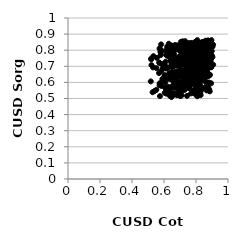
| Category | Series 0 |
|---|---|
| 0.8032709693896705 | 0.546 |
| 0.7423548564855764 | 0.582 |
| 0.6598434259487107 | 0.657 |
| 0.8691043415368068 | 0.675 |
| 0.8714225391466073 | 0.713 |
| 0.7827376489282902 | 0.551 |
| 0.6778970178173784 | 0.749 |
| 0.765579957225321 | 0.842 |
| 0.8115892868456154 | 0.724 |
| 0.796213893338463 | 0.794 |
| 0.7727589334761511 | 0.693 |
| 0.6329274914132588 | 0.784 |
| 0.8553405302881449 | 0.812 |
| 0.5689961544769234 | 0.658 |
| 0.7640300589531128 | 0.769 |
| 0.6557807507965396 | 0.641 |
| 0.6091190718727961 | 0.728 |
| 0.6632267273853174 | 0.774 |
| 0.8471008135141167 | 0.669 |
| 0.7099137604627728 | 0.739 |
| 0.5938261171411459 | 0.69 |
| 0.8681933570394909 | 0.732 |
| 0.64987128310343 | 0.825 |
| 0.5747970729806625 | 0.515 |
| 0.8402530996299308 | 0.564 |
| 0.5775720611950468 | 0.804 |
| 0.6837698497112241 | 0.748 |
| 0.6935339429260345 | 0.566 |
| 0.7906924804094604 | 0.55 |
| 0.7119114350522229 | 0.712 |
| 0.8137696616904289 | 0.706 |
| 0.7173182907097406 | 0.594 |
| 0.6727061191246002 | 0.829 |
| 0.8824640731678026 | 0.557 |
| 0.6939071413159161 | 0.714 |
| 0.6333331862572439 | 0.658 |
| 0.880119370819711 | 0.64 |
| 0.8771130128697302 | 0.693 |
| 0.6607062792613847 | 0.761 |
| 0.7282156086045215 | 0.558 |
| 0.8045231410309145 | 0.539 |
| 0.6472357720883822 | 0.774 |
| 0.8404713862704031 | 0.722 |
| 0.5397078846793173 | 0.546 |
| 0.7272654293517986 | 0.782 |
| 0.6522062979172762 | 0.815 |
| 0.8665192584665528 | 0.55 |
| 0.806164045816672 | 0.578 |
| 0.7362107198786281 | 0.818 |
| 0.7638232828013003 | 0.737 |
| 0.8195793910856913 | 0.6 |
| 0.6913165221718701 | 0.823 |
| 0.6327685582147213 | 0.542 |
| 0.6282035819923698 | 0.82 |
| 0.519693292914761 | 0.743 |
| 0.7469606546344709 | 0.803 |
| 0.7575331703740695 | 0.732 |
| 0.8288218761124342 | 0.823 |
| 0.8795981114739099 | 0.556 |
| 0.7050349001096436 | 0.762 |
| 0.8088200741405508 | 0.622 |
| 0.8286301080964353 | 0.64 |
| 0.6685274058431881 | 0.831 |
| 0.8227854008310271 | 0.613 |
| 0.7733393202095609 | 0.61 |
| 0.8072804352926395 | 0.572 |
| 0.861658471779306 | 0.821 |
| 0.8387816660067539 | 0.655 |
| 0.8759151413777412 | 0.591 |
| 0.7753280677120488 | 0.602 |
| 0.7538196244558724 | 0.704 |
| 0.7237128470297125 | 0.778 |
| 0.7755830877020009 | 0.59 |
| 0.8263482534901276 | 0.613 |
| 0.7725611516733412 | 0.681 |
| 0.6044058127038338 | 0.535 |
| 0.7388403730750214 | 0.705 |
| 0.7323420790990469 | 0.856 |
| 0.5721867065260565 | 0.811 |
| 0.5793302320056788 | 0.77 |
| 0.6459773080879805 | 0.735 |
| 0.8770519983634966 | 0.822 |
| 0.6194709167579291 | 0.809 |
| 0.6619589148823541 | 0.756 |
| 0.7542343827593938 | 0.72 |
| 0.7093017567323795 | 0.603 |
| 0.804156059186065 | 0.65 |
| 0.6474460923805192 | 0.829 |
| 0.6404696853076176 | 0.635 |
| 0.866151810777639 | 0.811 |
| 0.7257766805225991 | 0.609 |
| 0.7431477108776974 | 0.806 |
| 0.8363078032742416 | 0.841 |
| 0.8943332809760327 | 0.595 |
| 0.749058573822742 | 0.835 |
| 0.8089252955472758 | 0.847 |
| 0.7934841771219743 | 0.529 |
| 0.7695768371874804 | 0.836 |
| 0.7547589923511685 | 0.789 |
| 0.7421306874875271 | 0.696 |
| 0.75348026258225 | 0.705 |
| 0.7846083117250888 | 0.687 |
| 0.7125061593227802 | 0.633 |
| 0.7283871585288235 | 0.667 |
| 0.7994548251470469 | 0.772 |
| 0.6757330283038707 | 0.586 |
| 0.8801202028509731 | 0.599 |
| 0.6767604495825813 | 0.669 |
| 0.6838551736538475 | 0.706 |
| 0.6202162658376055 | 0.823 |
| 0.7583969121939733 | 0.799 |
| 0.7106939502998884 | 0.679 |
| 0.8534857246416968 | 0.61 |
| 0.8514262892064758 | 0.707 |
| 0.8166134649791368 | 0.788 |
| 0.7663943331490303 | 0.607 |
| 0.7312433982489948 | 0.68 |
| 0.8388205085107627 | 0.806 |
| 0.573473413349401 | 0.594 |
| 0.605248125059233 | 0.706 |
| 0.6364177093774204 | 0.517 |
| 0.8978253815106574 | 0.768 |
| 0.6845414932845755 | 0.83 |
| 0.7025712322271571 | 0.736 |
| 0.8638566810133051 | 0.636 |
| 0.7391472050033255 | 0.6 |
| 0.803992619431873 | 0.661 |
| 0.8860656333993523 | 0.544 |
| 0.6692000110771155 | 0.825 |
| 0.7137696789688032 | 0.634 |
| 0.7190120735686015 | 0.854 |
| 0.7806549943993195 | 0.801 |
| 0.6918135688422788 | 0.702 |
| 0.8664537927338196 | 0.597 |
| 0.6654469035957716 | 0.809 |
| 0.8402578489220114 | 0.775 |
| 0.7384934539696669 | 0.77 |
| 0.7512672709647772 | 0.602 |
| 0.7115889098477752 | 0.729 |
| 0.7203584612348345 | 0.733 |
| 0.7064198570597944 | 0.852 |
| 0.8105989640618897 | 0.744 |
| 0.7340453391882493 | 0.659 |
| 0.7295389295658214 | 0.607 |
| 0.6672661514933329 | 0.73 |
| 0.7688472253540917 | 0.532 |
| 0.8081610767742068 | 0.85 |
| 0.6622719589834678 | 0.704 |
| 0.6739571058094502 | 0.628 |
| 0.7318077837816779 | 0.631 |
| 0.7711310566042715 | 0.792 |
| 0.7276701120755408 | 0.578 |
| 0.7099986784619694 | 0.833 |
| 0.707141092402807 | 0.716 |
| 0.6536394769817286 | 0.694 |
| 0.8476036473724986 | 0.814 |
| 0.7289987892245122 | 0.753 |
| 0.7058838440510679 | 0.729 |
| 0.7436741864147498 | 0.698 |
| 0.8607209331284937 | 0.655 |
| 0.6154642180490486 | 0.53 |
| 0.8759411780651589 | 0.569 |
| 0.7055508929999025 | 0.792 |
| 0.8034355838342349 | 0.782 |
| 0.6479561899821824 | 0.824 |
| 0.742640021879776 | 0.634 |
| 0.779450347132422 | 0.538 |
| 0.8105051209622801 | 0.723 |
| 0.6301106878358884 | 0.84 |
| 0.8179566553021137 | 0.622 |
| 0.8313522321203889 | 0.757 |
| 0.8056391126235697 | 0.562 |
| 0.6332785449012553 | 0.622 |
| 0.5775161577887029 | 0.789 |
| 0.7795075506249245 | 0.709 |
| 0.7867610947239991 | 0.73 |
| 0.7098566358340308 | 0.52 |
| 0.8430538366364626 | 0.663 |
| 0.7536178042764098 | 0.701 |
| 0.7368473742050092 | 0.739 |
| 0.7305381670419013 | 0.618 |
| 0.82718887848626 | 0.568 |
| 0.6896869551601871 | 0.821 |
| 0.8752482424398266 | 0.813 |
| 0.8593856007419368 | 0.799 |
| 0.7265373918178524 | 0.786 |
| 0.7036787851549049 | 0.593 |
| 0.6565587777293431 | 0.525 |
| 0.8383410415097502 | 0.85 |
| 0.7972829842199722 | 0.717 |
| 0.5737951716121463 | 0.593 |
| 0.7542074944802746 | 0.654 |
| 0.7882678889008401 | 0.744 |
| 0.5173630703787712 | 0.606 |
| 0.774537172742852 | 0.823 |
| 0.8006778995175717 | 0.812 |
| 0.6928064798666982 | 0.639 |
| 0.8741063806953786 | 0.688 |
| 0.870817246412191 | 0.793 |
| 0.89450302686768 | 0.694 |
| 0.7392505908710123 | 0.735 |
| 0.6038164441284374 | 0.646 |
| 0.8362119118429244 | 0.68 |
| 0.7263367499885969 | 0.722 |
| 0.5314006532622519 | 0.693 |
| 0.6418031825860185 | 0.637 |
| 0.8075193728055542 | 0.514 |
| 0.7225342429461605 | 0.658 |
| 0.8553838301177639 | 0.762 |
| 0.781192668793234 | 0.651 |
| 0.6575897805093425 | 0.816 |
| 0.8119907067193153 | 0.71 |
| 0.7762066515214093 | 0.734 |
| 0.7256245793398888 | 0.781 |
| 0.7863880553086041 | 0.691 |
| 0.7909509361918339 | 0.665 |
| 0.6464478923391506 | 0.509 |
| 0.8272743025204821 | 0.536 |
| 0.6969344807598599 | 0.75 |
| 0.6166084746153143 | 0.767 |
| 0.6248821329984071 | 0.764 |
| 0.7736759634122263 | 0.674 |
| 0.6998454899499638 | 0.677 |
| 0.6979841043138573 | 0.519 |
| 0.8257973348162633 | 0.587 |
| 0.8949694678438953 | 0.696 |
| 0.6564048668223479 | 0.583 |
| 0.8135377942328204 | 0.603 |
| 0.8117417465970665 | 0.573 |
| 0.6571484864448363 | 0.786 |
| 0.8320771025849988 | 0.795 |
| 0.533887647944649 | 0.763 |
| 0.7907410657887838 | 0.534 |
| 0.8358017524959228 | 0.639 |
| 0.7794568502730198 | 0.621 |
| 0.7850541750455688 | 0.705 |
| 0.6418635814719591 | 0.785 |
| 0.5862020279319375 | 0.797 |
| 0.8391482701783927 | 0.773 |
| 0.8853080494634721 | 0.771 |
| 0.6724222661877335 | 0.728 |
| 0.763548444712587 | 0.673 |
| 0.7432097333449563 | 0.749 |
| 0.8051088386212268 | 0.599 |
| 0.6684249609323338 | 0.614 |
| 0.6256055548359836 | 0.573 |
| 0.780225585589942 | 0.781 |
| 0.6527471378187855 | 0.613 |
| 0.5522353841979484 | 0.554 |
| 0.7348350775101252 | 0.759 |
| 0.8674172011176938 | 0.769 |
| 0.6541757701839088 | 0.615 |
| 0.758494909651827 | 0.565 |
| 0.8043880667972751 | 0.815 |
| 0.8350919824585963 | 0.76 |
| 0.6941183682122629 | 0.802 |
| 0.7677942567391318 | 0.751 |
| 0.858767403330034 | 0.848 |
| 0.7899956717226198 | 0.838 |
| 0.7601010153337655 | 0.79 |
| 0.8229708177284629 | 0.806 |
| 0.9026632037954024 | 0.757 |
| 0.800653049115692 | 0.795 |
| 0.6743735953518992 | 0.656 |
| 0.7509926994845911 | 0.737 |
| 0.8041687026402066 | 0.563 |
| 0.7526626436029425 | 0.638 |
| 0.6590966436143617 | 0.535 |
| 0.7536124999165146 | 0.843 |
| 0.8482703252560583 | 0.615 |
| 0.7939350076979133 | 0.849 |
| 0.8065258767415783 | 0.539 |
| 0.7645281001276926 | 0.786 |
| 0.8298544823551988 | 0.548 |
| 0.900179090952779 | 0.828 |
| 0.7624680642739496 | 0.626 |
| 0.7569164949892593 | 0.582 |
| 0.8383278038372611 | 0.639 |
| 0.8927649718064053 | 0.742 |
| 0.8161274867208911 | 0.635 |
| 0.5898379512850087 | 0.621 |
| 0.7480391428663757 | 0.816 |
| 0.8422877342297211 | 0.705 |
| 0.8023822088120829 | 0.818 |
| 0.779887884954922 | 0.686 |
| 0.7246171414025189 | 0.573 |
| 0.6929604707624023 | 0.748 |
| 0.8090423591071062 | 0.703 |
| 0.6901081000426497 | 0.535 |
| 0.764297434544697 | 0.839 |
| 0.6389143337643344 | 0.735 |
| 0.5707921079398497 | 0.723 |
| 0.8734069489953272 | 0.785 |
| 0.7349379624645013 | 0.607 |
| 0.6466728139655606 | 0.719 |
| 0.811206891568404 | 0.752 |
| 0.7925205659479373 | 0.756 |
| 0.520673768344847 | 0.748 |
| 0.8945789761978964 | 0.72 |
| 0.6929046008509305 | 0.577 |
| 0.8070105750034693 | 0.789 |
| 0.8479890022797165 | 0.705 |
| 0.6469837983717996 | 0.648 |
| 0.8120115932521315 | 0.822 |
| 0.5708767215018441 | 0.722 |
| 0.7583929079497014 | 0.588 |
| 0.8571403182245638 | 0.627 |
| 0.8730019235811741 | 0.789 |
| 0.8566818354562867 | 0.739 |
| 0.8747554353596836 | 0.861 |
| 0.7123460083003081 | 0.547 |
| 0.6821340634445299 | 0.733 |
| 0.8062270229683994 | 0.688 |
| 0.7640222525272916 | 0.686 |
| 0.5218087248418877 | 0.707 |
| 0.5553833788162691 | 0.752 |
| 0.7020000690593868 | 0.595 |
| 0.7819106693216886 | 0.648 |
| 0.8470623523992796 | 0.852 |
| 0.7477594051710688 | 0.822 |
| 0.6045092104476655 | 0.632 |
| 0.7938500899156526 | 0.55 |
| 0.8019696741274474 | 0.809 |
| 0.5881167215792954 | 0.713 |
| 0.5847119534395125 | 0.578 |
| 0.8234609345021229 | 0.613 |
| 0.6147055295968982 | 0.546 |
| 0.8305534976725266 | 0.742 |
| 0.7600284535162085 | 0.728 |
| 0.7966381738687425 | 0.756 |
| 0.842016805765151 | 0.685 |
| 0.8963604844928772 | 0.862 |
| 0.7132939887153296 | 0.829 |
| 0.6136442408252278 | 0.686 |
| 0.6620749496418743 | 0.523 |
| 0.7303567890378486 | 0.838 |
| 0.8331524510055195 | 0.664 |
| 0.8782024948499749 | 0.752 |
| 0.8631691311011693 | 0.855 |
| 0.7021958533654091 | 0.562 |
| 0.8212627881632265 | 0.549 |
| 0.6905481701690392 | 0.588 |
| 0.5843848699094814 | 0.672 |
| 0.7984555521060686 | 0.688 |
| 0.7479962037426425 | 0.807 |
| 0.7895717574319614 | 0.779 |
| 0.8148357291184969 | 0.653 |
| 0.7596059266898231 | 0.732 |
| 0.878535743118565 | 0.844 |
| 0.7109751965561077 | 0.803 |
| 0.6131331666363796 | 0.773 |
| 0.711149110588448 | 0.595 |
| 0.7705928870002344 | 0.845 |
| 0.7075783105933062 | 0.656 |
| 0.7381533567015426 | 0.795 |
| 0.7193241067431531 | 0.777 |
| 0.6789615810448852 | 0.804 |
| 0.8488598629719599 | 0.782 |
| 0.6815795668717068 | 0.521 |
| 0.6443146969466802 | 0.698 |
| 0.7357550141190204 | 0.824 |
| 0.898684437132976 | 0.761 |
| 0.8156607896738238 | 0.773 |
| 0.5820125032003665 | 0.836 |
| 0.7789898338406039 | 0.695 |
| 0.8469566487373478 | 0.723 |
| 0.6320408128118286 | 0.543 |
| 0.7983889805592735 | 0.546 |
| 0.7808475260207768 | 0.827 |
| 0.7193998446460548 | 0.789 |
| 0.8329611126447011 | 0.805 |
| 0.9072055657991427 | 0.71 |
| 0.715821832068351 | 0.833 |
| 0.6807829316332223 | 0.637 |
| 0.7509141591388235 | 0.698 |
| 0.6073563672836835 | 0.6 |
| 0.7846266337321905 | 0.595 |
| 0.8985180164195321 | 0.795 |
| 0.788418188167696 | 0.604 |
| 0.7440517346513875 | 0.516 |
| 0.8745595736459906 | 0.764 |
| 0.7451315868311541 | 0.681 |
| 0.6333457851035424 | 0.564 |
| 0.7803465576700006 | 0.599 |
| 0.7266407566161125 | 0.844 |
| 0.8119710548975738 | 0.828 |
| 0.7781462191721147 | 0.832 |
| 0.7144540109199713 | 0.773 |
| 0.8627596986416805 | 0.573 |
| 0.891432073102078 | 0.808 |
| 0.7927588135876735 | 0.813 |
| 0.6671969799135951 | 0.661 |
| 0.6394920716680534 | 0.767 |
| 0.8795487075834098 | 0.733 |
| 0.7776661228548115 | 0.689 |
| 0.725141692567888 | 0.626 |
| 0.7850248939169768 | 0.683 |
| 0.6707863681837736 | 0.723 |
| 0.7042071909252797 | 0.515 |
| 0.7279414735946057 | 0.805 |
| 0.7807093109535631 | 0.624 |
| 0.8601098892734728 | 0.658 |
| 0.696602647457853 | 0.8 |
| 0.9028665268710335 | 0.821 |
| 0.7496861528930099 | 0.669 |
| 0.7124454491547627 | 0.718 |
| 0.7595169073905482 | 0.842 |
| 0.8101728938061662 | 0.748 |
| 0.7412976160061954 | 0.797 |
| 0.829073044866307 | 0.521 |
| 0.6627789700321143 | 0.569 |
| 0.8458955110160212 | 0.768 |
| 0.720998233209811 | 0.644 |
| 0.6973431610624727 | 0.634 |
| 0.7397530542890304 | 0.821 |
| 0.8082859846240666 | 0.863 |
| 0.6767712996713905 | 0.603 |
| 0.7366681329798902 | 0.846 |
| 0.8559858980377876 | 0.758 |
| 0.8422573661944027 | 0.684 |
| 0.8077389096691403 | 0.674 |
| 0.5287263242974136 | 0.539 |
| 0.8137883859945584 | 0.569 |
| 0.7243834140951371 | 0.722 |
| 0.7540998388795984 | 0.565 |
| 0.6419665067834401 | 0.564 |
| 0.6985687262895119 | 0.764 |
| 0.7300869025102039 | 0.607 |
| 0.85641895634088 | 0.686 |
| 0.8276561609494468 | 0.679 |
| 0.7986534627709758 | 0.566 |
| 0.6481959762830867 | 0.663 |
| 0.8183119058352626 | 0.826 |
| 0.6784050946348729 | 0.599 |
| 0.7713439262402546 | 0.799 |
| 0.6695382431777221 | 0.646 |
| 0.8423934151885003 | 0.82 |
| 0.6715606938360887 | 0.809 |
| 0.6832738430206557 | 0.561 |
| 0.7129834048692383 | 0.853 |
| 0.8385460785546646 | 0.564 |
| 0.8560104837313892 | 0.645 |
| 0.7945542566751029 | 0.851 |
| 0.8002679495648325 | 0.848 |
| 0.5724569885126723 | 0.583 |
| 0.77857943197154 | 0.814 |
| 0.8594375863678958 | 0.859 |
| 0.700066575963861 | 0.566 |
| 0.6954331284319875 | 0.809 |
| 0.624938892966353 | 0.692 |
| 0.7037854695383339 | 0.714 |
| 0.7653998547683083 | 0.587 |
| 0.6369128220791889 | 0.529 |
| 0.728683049739114 | 0.553 |
| 0.856505010820873 | 0.775 |
| 0.767332494151442 | 0.607 |
| 0.8154713937343239 | 0.821 |
| 0.7877830027053849 | 0.672 |
| 0.7771230823952247 | 0.734 |
| 0.8148705461186638 | 0.796 |
| 0.8599566270558348 | 0.824 |
| 0.6498553462943686 | 0.766 |
| 0.6168458684349563 | 0.795 |
| 0.6800800374894294 | 0.617 |
| 0.6070810010633103 | 0.567 |
| 0.7557997440843225 | 0.751 |
| 0.8885856552387491 | 0.855 |
| 0.7879666107145615 | 0.669 |
| 0.8107909594203093 | 0.828 |
| 0.6261305264700658 | 0.627 |
| 0.6335042168653562 | 0.643 |
| 0.7256665867089934 | 0.639 |
| 0.7906054455394613 | 0.682 |
| 0.9068686126098089 | 0.834 |
| 0.8068255628960719 | 0.589 |
| 0.806503593529063 | 0.635 |
| 0.6230557752472559 | 0.804 |
| 0.8146920373261196 | 0.826 |
| 0.7206968532603979 | 0.714 |
| 0.8325814338272863 | 0.562 |
| 0.692030561112282 | 0.521 |
| 0.701480780598622 | 0.744 |
| 0.8028665803945804 | 0.836 |
| 0.631035336219397 | 0.644 |
| 0.8277680012301826 | 0.844 |
| 0.8310039539280849 | 0.836 |
| 0.7896743056816145 | 0.816 |
| 0.7473300796512681 | 0.776 |
| 0.6933827467354097 | 0.75 |
| 0.7837306140328136 | 0.736 |
| 0.847223264280552 | 0.751 |
| 0.7531239869040832 | 0.771 |
| 0.8309323706556896 | 0.742 |
| 0.6058872633278418 | 0.64 |
| 0.7342831276152866 | 0.752 |
| 0.8796645780810213 | 0.652 |
| 0.6864470102702624 | 0.643 |
| 0.8876210591051094 | 0.647 |
| 0.889225017852929 | 0.836 |
| 0.5526495629607097 | 0.689 |